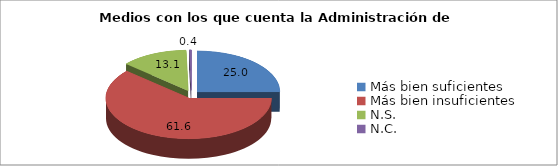
| Category | % |
|---|---|
| Más bien suficientes  | 25 |
| Más bien insuficientes | 61.6 |
| N.S.  | 13.1 |
| N.C.  | 0.4 |